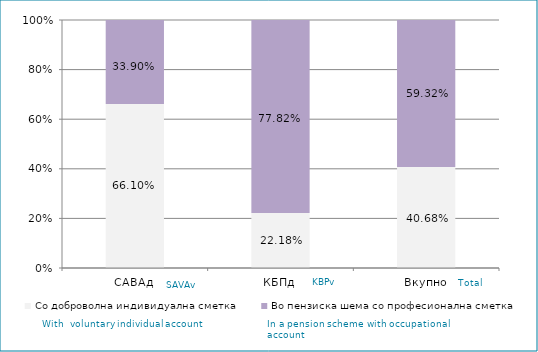
| Category | Со доброволна индивидуална сметка  | Во пензиска шема со професионална сметка |
|---|---|---|
| САВАд | 0.661 | 0.339 |
| КБПд | 0.222 | 0.778 |
| Вкупно | 0.407 | 0.593 |